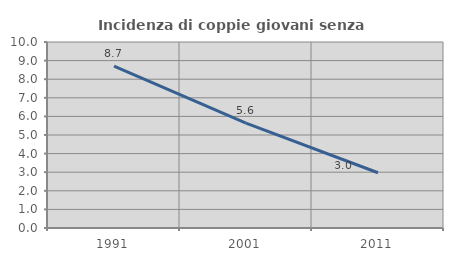
| Category | Incidenza di coppie giovani senza figli |
|---|---|
| 1991.0 | 8.709 |
| 2001.0 | 5.641 |
| 2011.0 | 2.97 |